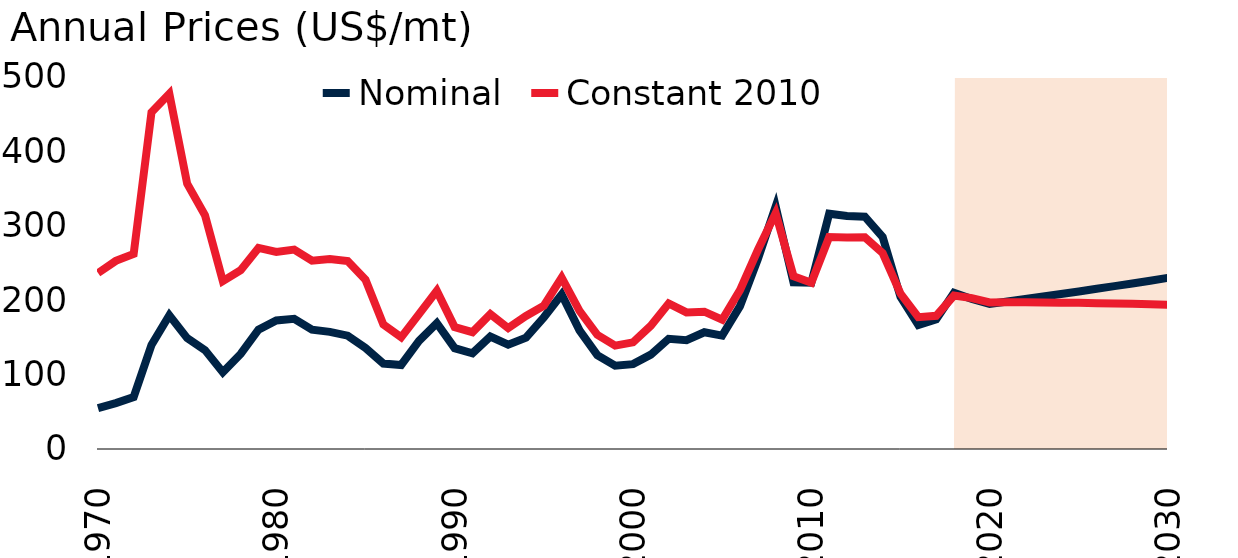
| Category | Nominal | Constant 2010 |
|---|---|---|
| 1970.0 | 54.902 | 236.5 |
| 1971.0 | 61.728 | 252.833 |
| 1972.0 | 69.812 | 262.131 |
| 1973.0 | 139.81 | 452.656 |
| 1974.0 | 179.706 | 477.434 |
| 1975.0 | 149.055 | 356.567 |
| 1976.0 | 132.92 | 314.113 |
| 1977.0 | 103.218 | 225.652 |
| 1978.0 | 127.745 | 240.313 |
| 1979.0 | 160.293 | 270.315 |
| 1980.0 | 172.727 | 264.819 |
| 1981.0 | 174.96 | 267.937 |
| 1982.0 | 160.355 | 253.11 |
| 1983.0 | 157.415 | 255.238 |
| 1984.0 | 152.333 | 252.556 |
| 1985.0 | 135.828 | 227.565 |
| 1986.0 | 114.917 | 167.393 |
| 1987.0 | 112.896 | 150.067 |
| 1988.0 | 145.199 | 181.243 |
| 1989.0 | 169.235 | 212.518 |
| 1990.0 | 135.522 | 163.927 |
| 1991.0 | 128.665 | 157.077 |
| 1992.0 | 151.2 | 181.201 |
| 1993.0 | 140.238 | 162.458 |
| 1994.0 | 149.729 | 178.824 |
| 1995.0 | 176.982 | 192.54 |
| 1996.0 | 207.6 | 230.235 |
| 1997.0 | 159.484 | 185.615 |
| 1998.0 | 126.127 | 153.493 |
| 1999.0 | 112.042 | 139.025 |
| 2000.0 | 114.088 | 143.399 |
| 2001.0 | 126.808 | 165.596 |
| 2002.0 | 148.078 | 195.655 |
| 2003.0 | 146.143 | 183.555 |
| 2004.0 | 156.882 | 184.51 |
| 2005.0 | 152.351 | 173.709 |
| 2006.0 | 192.043 | 213.557 |
| 2007.0 | 255.206 | 267.428 |
| 2008.0 | 326.03 | 317.045 |
| 2009.0 | 224.07 | 232.288 |
| 2010.0 | 223.582 | 223.582 |
| 2011.0 | 316.264 | 284.934 |
| 2012.0 | 313.242 | 284.313 |
| 2013.0 | 312.248 | 284.652 |
| 2014.0 | 284.886 | 263.253 |
| 2015.0 | 204.449 | 208.924 |
| 2016.0 | 166.633 | 177.205 |
| 2017.0 | 174.196 | 178.99 |
| 2018.0 | 209.929 | 206.258 |
| 2019.0 | 201.692 | 202.75 |
| 2020.0 | 195 | 196.991 |
| 2021.0 | 198.246 | 197.121 |
| 2022.0 | 201.546 | 197.099 |
| 2023.0 | 204.9 | 196.962 |
| 2024.0 | 208.311 | 196.733 |
| 2025.0 | 211.778 | 196.425 |
| 2026.0 | 215.303 | 196.05 |
| 2027.0 | 218.887 | 195.615 |
| 2028.0 | 222.53 | 195.124 |
| 2029.0 | 226.234 | 194.584 |
| 2030.0 | 230 | 193.995 |